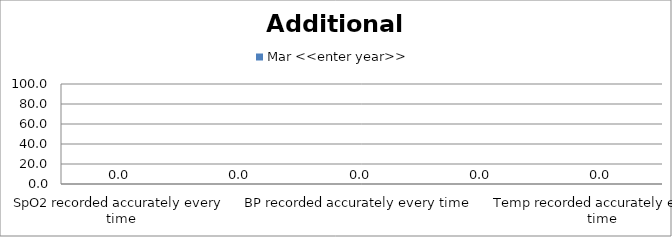
| Category | Mar <<enter year>> |
|---|---|
| SpO2 recorded accurately every time | 0 |
| CRT recorded accurately every time | 0 |
| BP recorded accurately every time | 0 |
| Skin Colour recorded accurately every time | 0 |
| Temp recorded accurately every time | 0 |